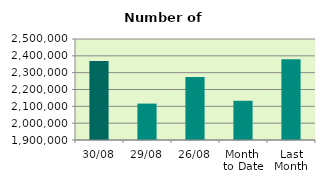
| Category | Series 0 |
|---|---|
| 30/08 | 2369708 |
| 29/08 | 2116296 |
| 26/08 | 2274436 |
| Month 
to Date | 2132947.636 |
| Last
Month | 2380266.19 |